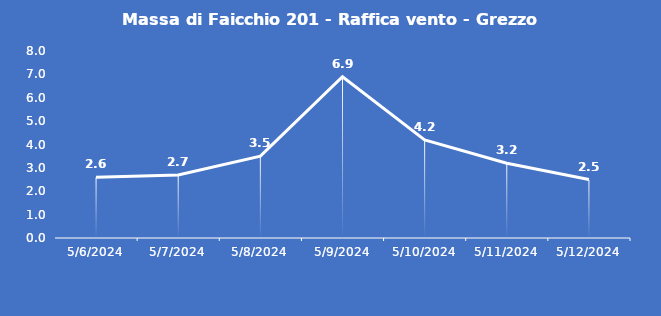
| Category | Massa di Faicchio 201 - Raffica vento - Grezzo (m/s) |
|---|---|
| 5/6/24 | 2.6 |
| 5/7/24 | 2.7 |
| 5/8/24 | 3.5 |
| 5/9/24 | 6.9 |
| 5/10/24 | 4.2 |
| 5/11/24 | 3.2 |
| 5/12/24 | 2.5 |